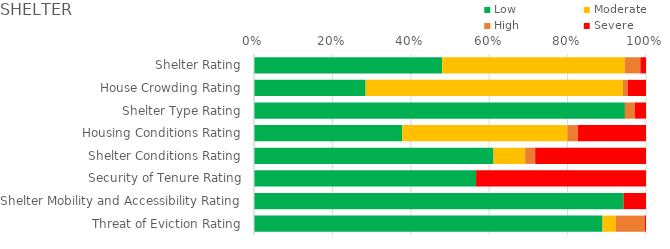
| Category | Low | Moderate | High | Severe |
|---|---|---|---|---|
| Shelter Rating | 0.48 | 0.466 | 0.039 | 0.014 |
| House Crowding Rating | 0.285 | 0.657 | 0.012 | 0.047 |
| Shelter Type Rating | 0.946 | 0 | 0.026 | 0.028 |
| Housing Conditions Rating | 0.378 | 0.421 | 0.027 | 0.174 |
| Shelter Conditions Rating | 0.611 | 0.081 | 0.026 | 0.283 |
| Security of Tenure Rating | 0.566 | 0 | 0 | 0.434 |
| Shelter Mobility and Accessibility Rating | 0.942 | 0 | 0 | 0.058 |
| Threat of Eviction Rating | 0.889 | 0.033 | 0.075 | 0.002 |